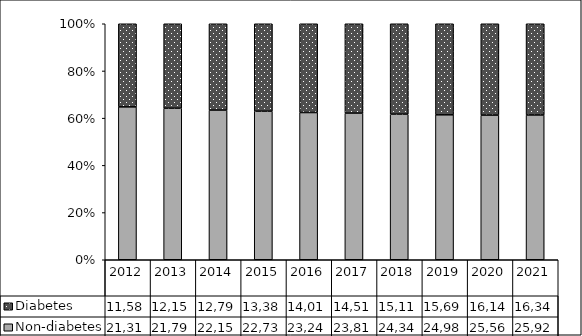
| Category | Non-diabetes | Diabetes |
|---|---|---|
| 2012 | 21310 | 11585 |
| 2013 | 21791 | 12150 |
| 2014 | 22158 | 12794 |
| 2015 | 22738 | 13385 |
| 2016 | 23246 | 14018 |
| 2017 | 23817 | 14519 |
| 2018 | 24343 | 15110 |
| 2019 | 24983 | 15694 |
| 2020 | 25563 | 16149 |
| 2021 | 25928 | 16343 |